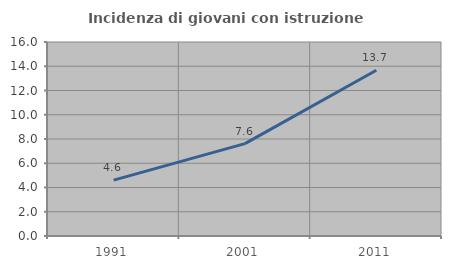
| Category | Incidenza di giovani con istruzione universitaria |
|---|---|
| 1991.0 | 4.608 |
| 2001.0 | 7.619 |
| 2011.0 | 13.669 |